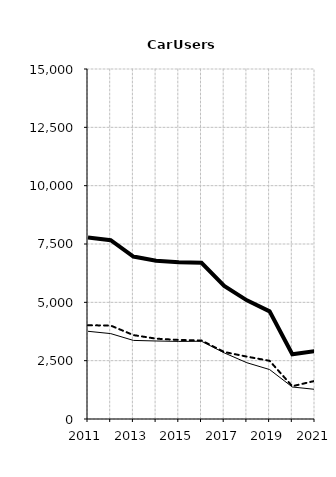
| Category | Built-up | Non built-up | Total |
|---|---|---|---|
| 2011.0 | 3759 | 4018 | 7777 |
| 2012.0 | 3660 | 4005 | 7665 |
| 2013.0 | 3368 | 3596 | 6964 |
| 2014.0 | 3343 | 3443 | 6786 |
| 2015.0 | 3325 | 3388 | 6713 |
| 2016.0 | 3332 | 3365 | 6697 |
| 2017.0 | 2835 | 2872 | 5707 |
| 2018.0 | 2412 | 2673 | 5085 |
| 2019.0 | 2120 | 2494 | 4614 |
| 2020.0 | 1372 | 1404 | 2776 |
| 2021.0 | 1270 | 1635 | 2905 |